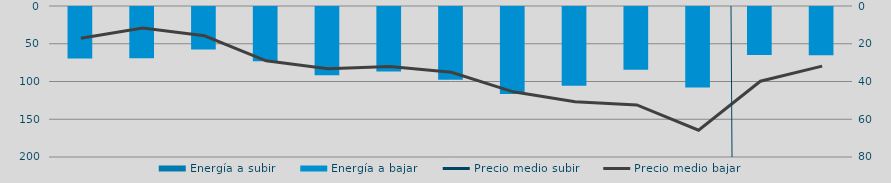
| Category | Energía a subir | Energía a bajar |
|---|---|---|
| D |  | 69.477 |
| E |  | 69.238 |
| F |  | 57.736 |
| M |  | 73.082 |
| A |  | 91.861 |
| M |  | 86.755 |
| J |  | 97.6 |
| J |  | 116.442 |
| A |  | 105.775 |
| S |  | 84.597 |
| O |  | 108.041 |
| N |  | 65.058 |
| D |  | 65.081 |